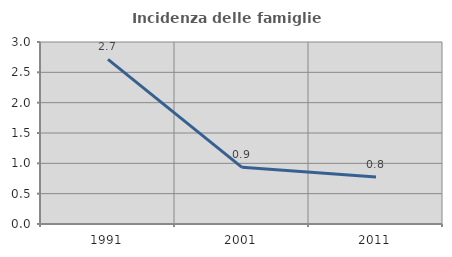
| Category | Incidenza delle famiglie numerose |
|---|---|
| 1991.0 | 2.713 |
| 2001.0 | 0.933 |
| 2011.0 | 0.774 |